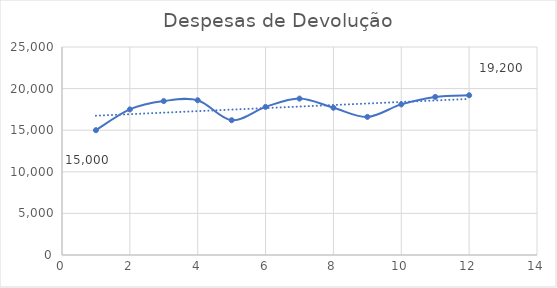
| Category | Despesas de Devolução |
|---|---|
| 1.0 | 15000 |
| 2.0 | 17500 |
| 3.0 | 18500 |
| 4.0 | 18600 |
| 5.0 | 16200 |
| 6.0 | 17800 |
| 7.0 | 18800 |
| 8.0 | 17700 |
| 9.0 | 16600 |
| 10.0 | 18100 |
| 11.0 | 19000 |
| 12.0 | 19200 |